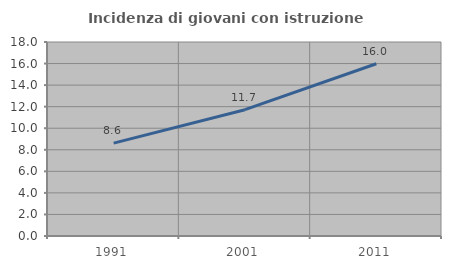
| Category | Incidenza di giovani con istruzione universitaria |
|---|---|
| 1991.0 | 8.614 |
| 2001.0 | 11.72 |
| 2011.0 | 15.982 |